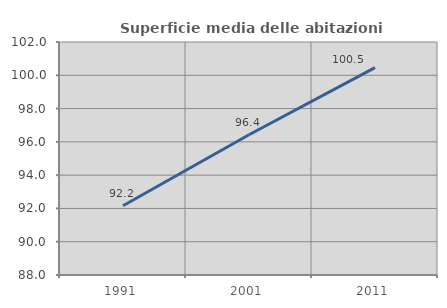
| Category | Superficie media delle abitazioni occupate |
|---|---|
| 1991.0 | 92.159 |
| 2001.0 | 96.428 |
| 2011.0 | 100.464 |